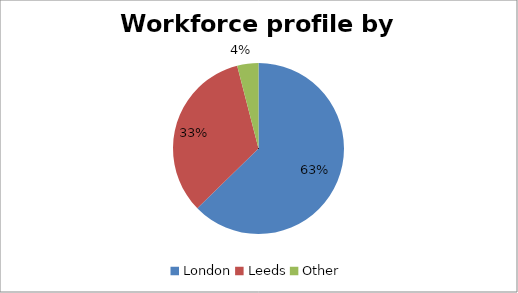
| Category | Series 0 | Series 1 |
|---|---|---|
| London | 1156 | 0.63 |
| Leeds | 614 | 0.33 |
| Other | 74 | 0.04 |